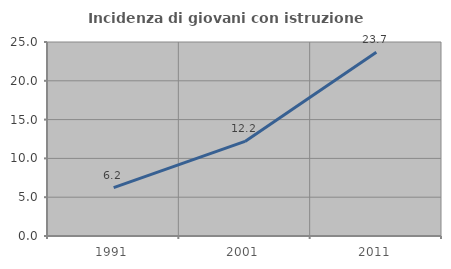
| Category | Incidenza di giovani con istruzione universitaria |
|---|---|
| 1991.0 | 6.24 |
| 2001.0 | 12.188 |
| 2011.0 | 23.671 |